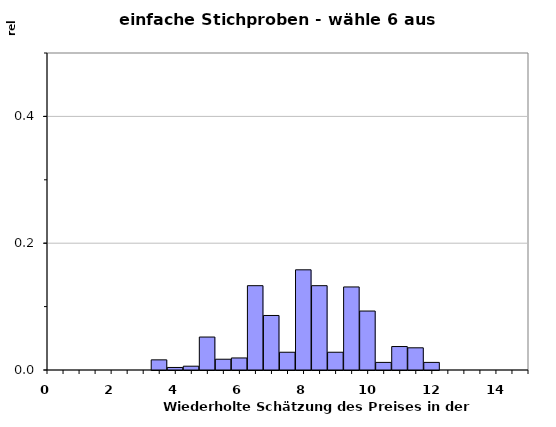
| Category | Methode 1 |
|---|---|
| 0.0 | 0 |
| 0.5 | 0 |
| 1.0 | 0 |
| 1.5 | 0 |
| 2.0 | 0 |
| 2.5 | 0 |
| 3.0 | 0 |
| 3.5 | 0.016 |
| 4.0 | 0.004 |
| 4.5 | 0.006 |
| 5.0 | 0.052 |
| 5.5 | 0.017 |
| 6.0 | 0.019 |
| 6.5 | 0.133 |
| 7.0 | 0.086 |
| 7.5 | 0.028 |
| 8.0 | 0.158 |
| 8.5 | 0.133 |
| 9.0 | 0.028 |
| 9.5 | 0.131 |
| 10.0 | 0.093 |
| 10.5 | 0.012 |
| 11.0 | 0.037 |
| 11.5 | 0.035 |
| 12.0 | 0.012 |
| 12.5 | 0 |
| 13.0 | 0 |
| 13.5 | 0 |
| 14.0 | 0 |
| 14.5 | 0 |
| 15.0 | 0 |